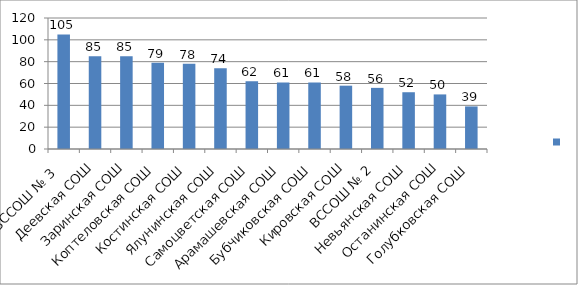
| Category | Series 0 |
|---|---|
| ВССОШ № 3  | 105 |
| Деевская СОШ | 85 |
| Заринская СОШ | 85 |
| Коптеловская СОШ | 79 |
| Костинская СОШ | 78 |
| Ялунинская СОШ | 74 |
| Самоцветская СОШ | 62 |
| Арамашевская СОШ | 61 |
| Бубчиковская СОШ | 61 |
| Кировская СОШ | 58 |
| ВССОШ № 2 | 56 |
| Невьянская СОШ | 52 |
| Останинская СОШ | 50 |
| Голубковская СОШ | 39 |